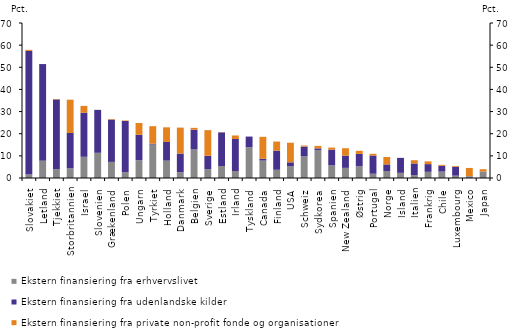
| Category | Ekstern finansiering fra erhvervslivet | Ekstern finansiering fra udenlandske kilder | Ekstern finansiering fra private non-profit fonde og organisationer |
|---|---|---|---|
| Slovakiet | 1.6 | 55.818 | 0.462 |
| Letland | 7.804 | 43.651 | 0 |
| Tjekkiet | 3.962 | 31.532 | 0.178 |
| Storbritannien | 4.355 | 15.968 | 15.053 |
| Israel | 9.571 | 19.899 | 3.088 |
| Slovenien | 11.382 | 19.379 | 0.024 |
| Grækenland | 7.27 | 19.103 | 0.254 |
| Polen | 2.604 | 23.148 | 0.23 |
| Ungarn | 8.022 | 11.503 | 5.309 |
| Tyrkiet | 15.11 | 0.386 | 7.913 |
| Holland | 7.848 | 8.429 | 6.609 |
| Danmark | 2.607 | 8.436 | 11.72 |
| Belgien | 12.89 | 8.946 | 0.811 |
| Sverige | 4.021 | 6.031 | 11.562 |
| Estland | 5.398 | 15.205 | 0.088 |
| Irland | 3.158 | 14.453 | 1.597 |
| Tyskland | 13.873 | 4.834 | 0 |
| Canada | 7.858 | 0.858 | 9.88 |
| Finland | 3.722 | 8.625 | 4.113 |
| USA | 5.311 | 1.77 | 8.845 |
| Schweiz | 9.782 | 4.423 | 0.441 |
| Sydkorea | 12.589 | 0.774 | 1.141 |
| Spanien | 5.697 | 7.127 | 0.918 |
| New Zealand | 4.583 | 5.521 | 3.333 |
| Østrig | 5.291 | 5.591 | 1.4 |
| Portugal | 1.924 | 8.233 | 0.754 |
| Norge | 3.134 | 3.001 | 3.355 |
| Island | 2.33 | 6.766 | 0 |
| Italien | 1.302 | 5.279 | 1.449 |
| Frankrig | 2.788 | 3.488 | 1.238 |
| Chile | 2.904 | 2.598 | 0.447 |
| Luxembourg | 1.055 | 4.058 | 0.325 |
| Mexico | 0.755 | 0.085 | 3.706 |
| Japan | 2.795 | 0.12 | 1.055 |